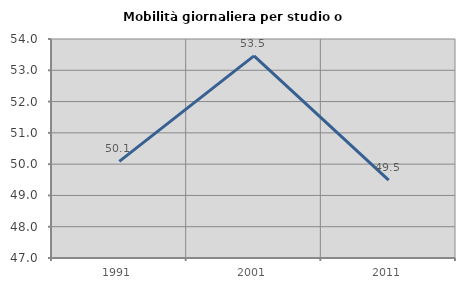
| Category | Mobilità giornaliera per studio o lavoro |
|---|---|
| 1991.0 | 50.09 |
| 2001.0 | 53.462 |
| 2011.0 | 49.487 |